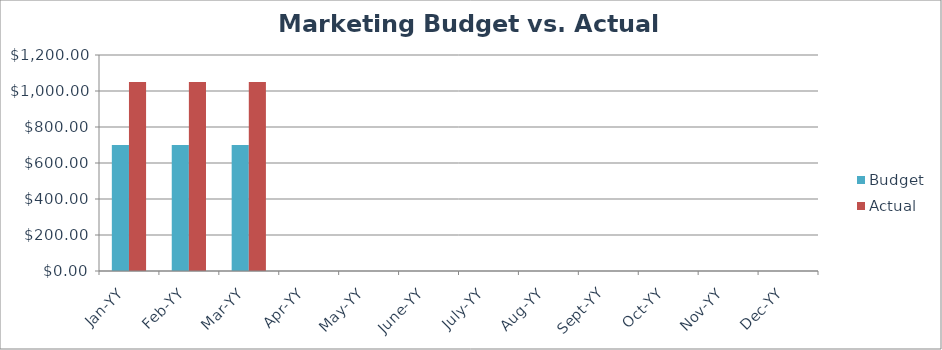
| Category | Budget | Actual |
|---|---|---|
| Jan-YY | 700 | 1050 |
| Feb-YY | 700 | 1050 |
| Mar-YY | 700 | 1050 |
| Apr-YY | 0 | 0 |
| May-YY | 0 | 0 |
| June-YY | 0 | 0 |
| July-YY | 0 | 0 |
| Aug-YY | 0 | 0 |
| Sept-YY | 0 | 0 |
| Oct-YY | 0 | 0 |
| Nov-YY | 0 | 0 |
| Dec-YY | 0 | 0 |